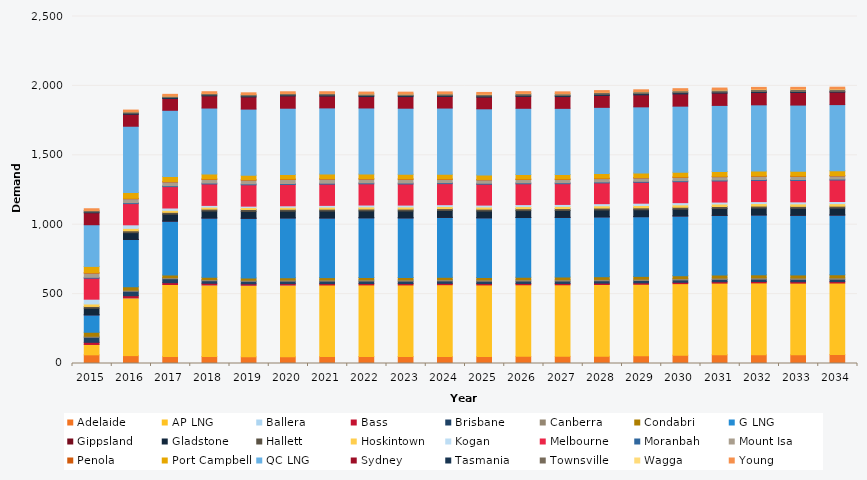
| Category | Adelaide | AP LNG | Ballera | Bass | Brisbane | Canberra | Condabri | G LNG | Gippsland | Gladstone | Hallett | Hoskintown | Kogan | Melbourne | Moranbah | Mount Isa | Penola | Port Campbell | QC LNG | Sydney | Tasmania | Townsville | Wagga | Young |
|---|---|---|---|---|---|---|---|---|---|---|---|---|---|---|---|---|---|---|---|---|---|---|---|---|
| 2015.0 | 62.535 | 74.56 | 0.001 | 15.493 | 36.151 | 7.944 | 28.47 | 125.305 | 0.648 | 47.158 | 12.722 | 17.839 | 34.582 | 151.049 | 6.271 | 30.314 | 3.239 | 45.262 | 300.18 | 86.155 | 6.368 | 10.798 | 0.056 | 11.796 |
| 2016.0 | 56.899 | 415.774 | 0.004 | 15.732 | 32.154 | 8.064 | 24.255 | 340.405 | 0.585 | 48.836 | 13.46 | 17.368 | 25.675 | 152.765 | 6.577 | 28.121 | 3.265 | 41.915 | 477.543 | 86.01 | 7.932 | 10.601 | 0.082 | 11.805 |
| 2017.0 | 50.849 | 518.183 | 0.008 | 13.166 | 28.565 | 8.245 | 18.642 | 388.368 | 0.601 | 49.117 | 13.315 | 14.29 | 16.926 | 154.006 | 6.561 | 26.92 | 3.304 | 37.084 | 476.087 | 84.974 | 7.628 | 10.194 | 0.221 | 11.914 |
| 2018.0 | 50.205 | 515.761 | 0.015 | 11.981 | 18.24 | 8.413 | 16.761 | 427.12 | 0.63 | 49.604 | 13.586 | 14.091 | 12.585 | 154.457 | 6.545 | 26.737 | 3.32 | 34.4 | 476.087 | 87.586 | 7.664 | 9.766 | 0.53 | 12.02 |
| 2019.0 | 48.009 | 515.761 | 0.009 | 10.049 | 18.143 | 8.563 | 15.824 | 430.065 | 0.571 | 48.975 | 13.415 | 13.889 | 10.46 | 153.687 | 6.529 | 27.09 | 3.315 | 32.554 | 476.087 | 87.648 | 7.569 | 9.53 | 0.373 | 12.082 |
| 2020.0 | 48.137 | 517.174 | 0.008 | 9.989 | 17.908 | 8.7 | 15.867 | 431.243 | 0.642 | 48.041 | 13.459 | 14.064 | 10.993 | 153.264 | 6.684 | 29.851 | 3.319 | 32.556 | 477.391 | 88.622 | 7.527 | 9.672 | 0.499 | 12.125 |
| 2021.0 | 49.963 | 515.761 | 0 | 9.85 | 18.051 | 8.843 | 16.319 | 430.065 | 0.673 | 49.059 | 13.455 | 14.418 | 12.683 | 152.957 | 6.83 | 29.36 | 3.326 | 33.675 | 476.087 | 85.516 | 7.84 | 10.415 | 0.666 | 12.154 |
| 2022.0 | 50.574 | 515.761 | 0 | 9.788 | 17.96 | 8.98 | 16.604 | 430.065 | 0.792 | 49.057 | 13.48 | 14.998 | 13.763 | 152.543 | 6.969 | 26.857 | 3.345 | 33.249 | 476.087 | 82.105 | 8.473 | 10.832 | 1.077 | 12.169 |
| 2023.0 | 50.404 | 515.761 | 0 | 9.71 | 17.661 | 9.127 | 16.524 | 430.065 | 0.819 | 49.058 | 13.447 | 15.081 | 13.706 | 151.844 | 6.953 | 26.706 | 3.344 | 33.031 | 476.087 | 83.356 | 8.069 | 10.978 | 1.003 | 12.225 |
| 2024.0 | 50.528 | 517.174 | 0 | 9.679 | 17.571 | 9.285 | 16.839 | 431.243 | 0.899 | 49.049 | 13.506 | 14.989 | 13.608 | 151.364 | 6.937 | 23.899 | 3.358 | 33.037 | 477.391 | 83.598 | 8.302 | 11.114 | 1.088 | 12.294 |
| 2025.0 | 50.4 | 515.761 | 0 | 9.653 | 17.282 | 9.443 | 17.072 | 430.065 | 0.837 | 48.049 | 13.52 | 15.282 | 13.921 | 150.419 | 6.922 | 23.897 | 3.361 | 33.052 | 476.087 | 84.516 | 8.31 | 11.361 | 1.302 | 12.366 |
| 2026.0 | 51.379 | 515.761 | 0 | 9.644 | 17.331 | 9.6 | 17.754 | 430.065 | 0.841 | 49.062 | 13.528 | 15.558 | 14.306 | 149.816 | 6.907 | 23.904 | 3.365 | 33.742 | 476.087 | 85.851 | 8.43 | 11.682 | 1.546 | 12.442 |
| 2027.0 | 51.348 | 515.761 | 0 | 9.652 | 17.289 | 9.729 | 18.675 | 430.065 | 0.704 | 49.077 | 13.567 | 15.984 | 14.134 | 149.227 | 6.891 | 24.012 | 3.361 | 32.643 | 476.087 | 84.645 | 8.539 | 11.931 | 1.359 | 12.47 |
| 2028.0 | 51.952 | 517.174 | 0 | 9.674 | 17.252 | 9.829 | 19.332 | 431.243 | 0.756 | 49.091 | 13.632 | 16.445 | 15.191 | 149.549 | 6.876 | 24.019 | 3.385 | 32.638 | 477.391 | 85.755 | 8.688 | 12.46 | 1.406 | 12.467 |
| 2029.0 | 55.123 | 515.761 | 0 | 9.696 | 17.245 | 9.927 | 19.925 | 430.065 | 0.772 | 49.101 | 13.744 | 16.838 | 16.818 | 150.453 | 6.861 | 24.023 | 3.407 | 33.196 | 476.087 | 86.513 | 9.09 | 13.133 | 1.655 | 12.453 |
| 2030.0 | 59.624 | 515.761 | 0 | 9.736 | 16.972 | 10.025 | 20.788 | 430.065 | 0.937 | 48.104 | 13.708 | 17.407 | 15.796 | 150.987 | 6.846 | 24.021 | 3.429 | 33.88 | 476.087 | 88.131 | 9.207 | 13.689 | 2.28 | 12.45 |
| 2031.0 | 63.433 | 515.761 | 0 | 9.809 | 17.123 | 10.146 | 20.807 | 430.065 | 1.032 | 49.109 | 13.796 | 17.968 | 14.045 | 152.075 | 6.831 | 23.378 | 3.478 | 34.494 | 476.087 | 88.654 | 7.693 | 13.905 | 2.357 | 12.485 |
| 2032.0 | 63.549 | 517.174 | 0 | 9.887 | 17.05 | 10.29 | 21.035 | 431.243 | 1.001 | 49.116 | 13.885 | 18.064 | 14.12 | 152.601 | 6.816 | 22.989 | 3.462 | 33.919 | 477.391 | 88.495 | 7.572 | 14.157 | 2.89 | 12.548 |
| 2033.0 | 63.344 | 515.761 | 0 | 9.965 | 17.123 | 10.433 | 21.405 | 430.065 | 0.991 | 49.123 | 13.853 | 18.04 | 14.504 | 153.77 | 6.801 | 22.601 | 3.488 | 34.559 | 476.087 | 90.463 | 7.474 | 14.269 | 2.961 | 12.613 |
| 2034.0 | 64.163 | 515.761 | 0 | 10.048 | 17.043 | 10.577 | 21.878 | 430.065 | 1 | 49.132 | 13.96 | 18.053 | 15.273 | 155.017 | 6.802 | 22.214 | 3.505 | 34.651 | 476.087 | 89.86 | 5.727 | 14.503 | 2.692 | 12.68 |